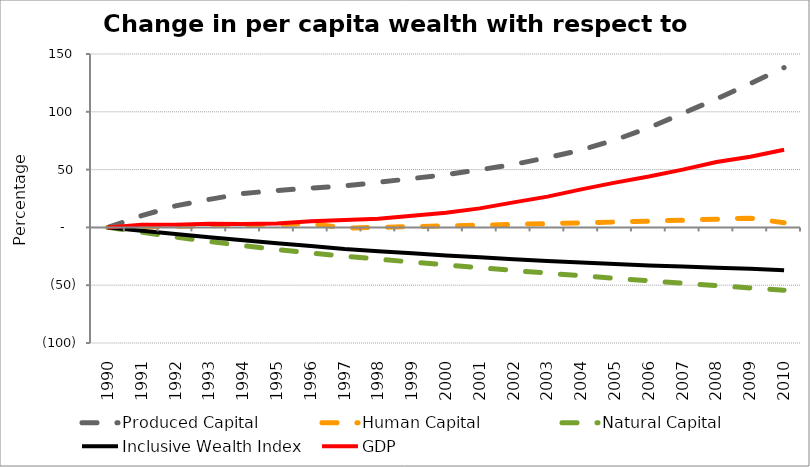
| Category | Produced Capital  | Human Capital | Natural Capital | Inclusive Wealth Index | GDP |
|---|---|---|---|---|---|
| 1990.0 | 0 | 0 | 0 | 0 | 0 |
| 1991.0 | 10.118 | 0.39 | -4.185 | -2.875 | 2.279 |
| 1992.0 | 18.632 | 0.89 | -8.265 | -5.731 | 2.388 |
| 1993.0 | 24.273 | 1.455 | -12.155 | -8.569 | 3.211 |
| 1994.0 | 29.358 | 2.051 | -15.77 | -11.206 | 2.853 |
| 1995.0 | 31.927 | 2.66 | -19.077 | -13.717 | 3.392 |
| 1996.0 | 33.985 | 3.229 | -22.094 | -16.02 | 5.392 |
| 1997.0 | 35.932 | -0.582 | -24.88 | -18.694 | 6.369 |
| 1998.0 | 38.969 | 0.049 | -27.497 | -20.611 | 7.556 |
| 1999.0 | 42.299 | 0.687 | -30.015 | -22.43 | 10.08 |
| 2000.0 | 45.673 | 1.289 | -32.477 | -24.206 | 12.622 |
| 2001.0 | 49.876 | 1.897 | -34.894 | -25.901 | 16.46 |
| 2002.0 | 54.467 | 2.6 | -37.256 | -27.519 | 21.653 |
| 2003.0 | 60.329 | 3.289 | -39.567 | -29.032 | 26.623 |
| 2004.0 | 66.919 | 3.963 | -41.826 | -30.469 | 32.887 |
| 2005.0 | 75.653 | 4.612 | -44.035 | -31.757 | 38.764 |
| 2006.0 | 86.244 | 5.411 | -46.187 | -32.884 | 44.036 |
| 2007.0 | 98.601 | 6.234 | -48.29 | -33.877 | 50.013 |
| 2008.0 | 111.114 | 7.103 | -50.344 | -34.817 | 56.513 |
| 2009.0 | 124.449 | 7.995 | -52.347 | -35.67 | 61.17 |
| 2010.0 | 138.204 | 4.072 | -54.298 | -37.07 | 67.119 |